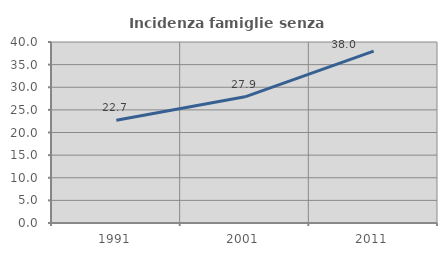
| Category | Incidenza famiglie senza nuclei |
|---|---|
| 1991.0 | 22.708 |
| 2001.0 | 27.88 |
| 2011.0 | 37.982 |